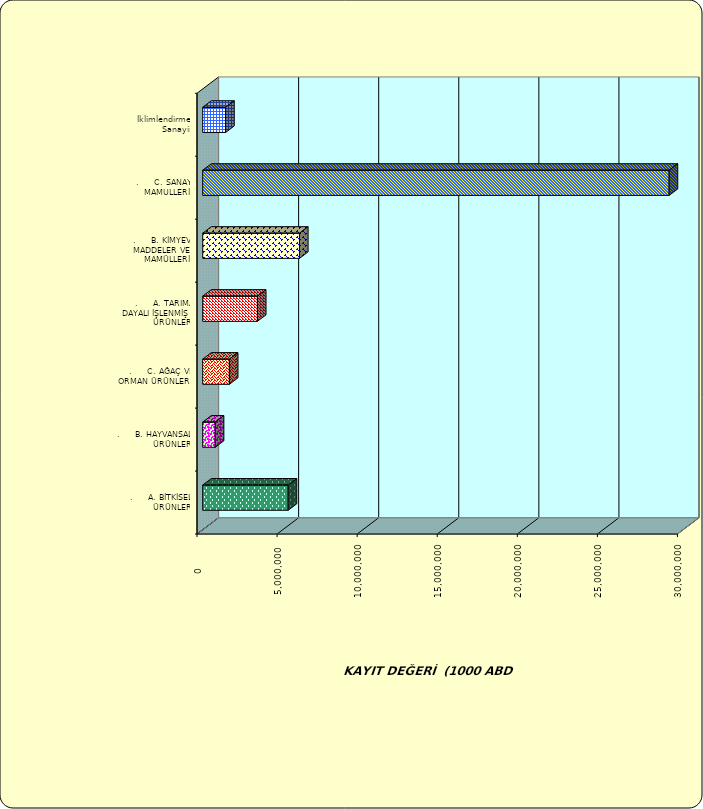
| Category | Series 0 |
|---|---|
| .     A. BİTKİSEL ÜRÜNLER | 5339144.409 |
| .     B. HAYVANSAL ÜRÜNLER | 784482.694 |
| .     C. AĞAÇ VE ORMAN ÜRÜNLERİ | 1666003.679 |
| .     A. TARIMA DAYALI İŞLENMİŞ ÜRÜNLER | 3415979.474 |
| .     B. KİMYEVİ MADDELER VE MAMÜLLERİ | 6044142.979 |
| .     C. SANAYİ MAMULLERİ | 29125460.107 |
|  İklimlendirme Sanayii | 1433027.069 |